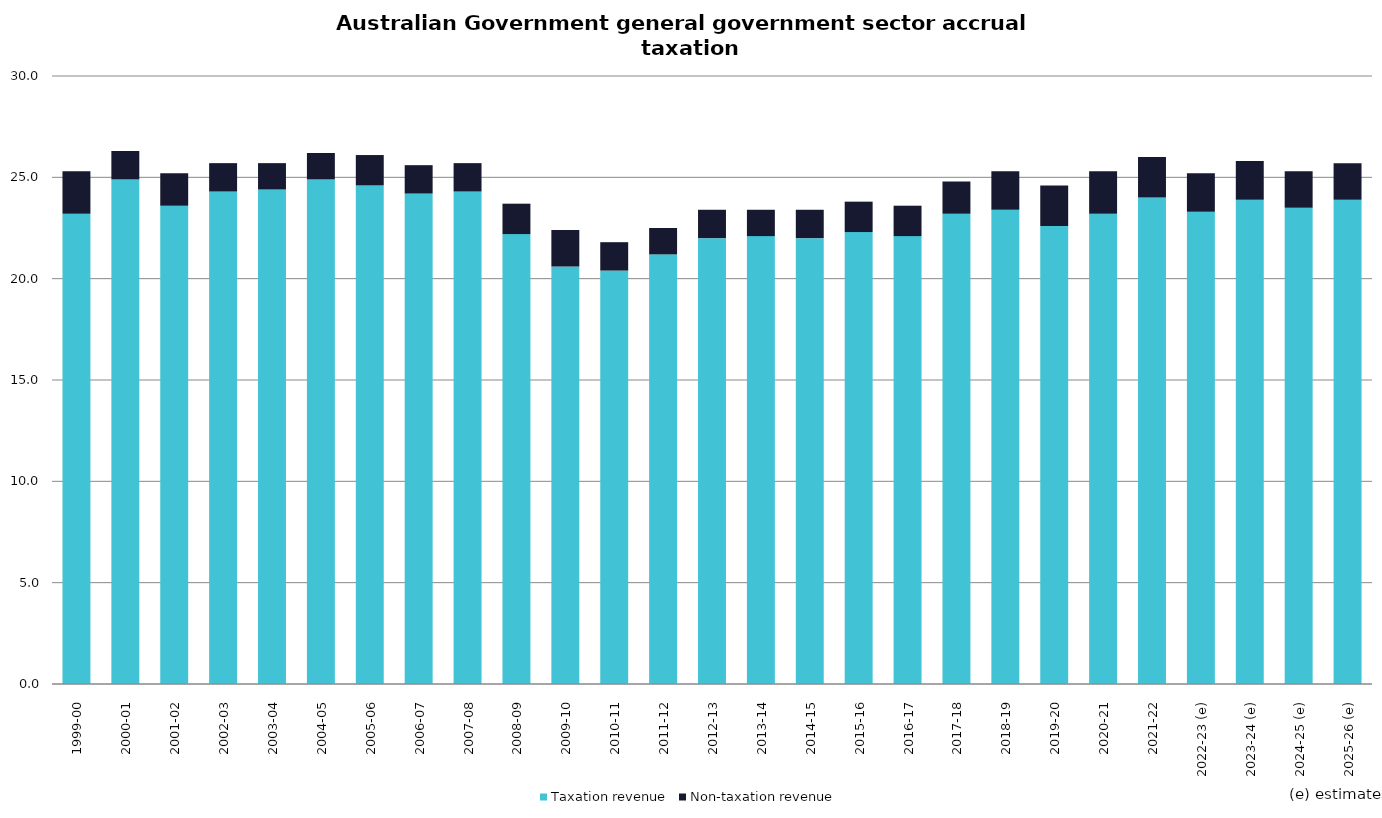
| Category | Taxation revenue | Non-taxation revenue |
|---|---|---|
| 1999-00 | 23.2 | 2.1 |
| 2000-01 | 24.9 | 1.4 |
| 2001-02 | 23.6 | 1.6 |
| 2002-03 | 24.3 | 1.4 |
| 2003-04 | 24.4 | 1.3 |
| 2004-05 | 24.9 | 1.3 |
| 2005-06 | 24.6 | 1.5 |
| 2006-07 | 24.2 | 1.4 |
| 2007-08 | 24.3 | 1.4 |
| 2008-09 | 22.2 | 1.5 |
| 2009-10 | 20.6 | 1.8 |
| 2010-11 | 20.4 | 1.4 |
| 2011-12 | 21.2 | 1.3 |
| 2012-13 | 22 | 1.4 |
| 2013-14 | 22.1 | 1.3 |
| 2014-15 | 22 | 1.4 |
| 2015-16 | 22.3 | 1.5 |
| 2016-17 | 22.1 | 1.5 |
| 2017-18 | 23.2 | 1.6 |
| 2018-19 | 23.4 | 1.9 |
| 2019-20 | 22.6 | 2 |
| 2020-21 | 23.2 | 2.1 |
| 2021-22 | 24 | 2 |
| 2022-23 (e) | 23.3 | 1.9 |
| 2023-24 (e) | 23.9 | 1.9 |
| 2024-25 (e) | 23.5 | 1.8 |
| 2025-26 (e) | 23.9 | 1.8 |